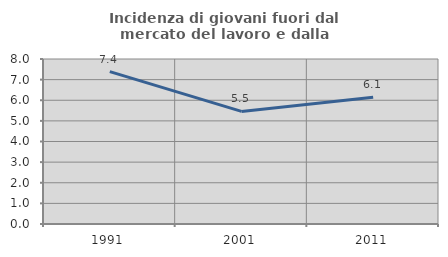
| Category | Incidenza di giovani fuori dal mercato del lavoro e dalla formazione  |
|---|---|
| 1991.0 | 7.387 |
| 2001.0 | 5.459 |
| 2011.0 | 6.142 |